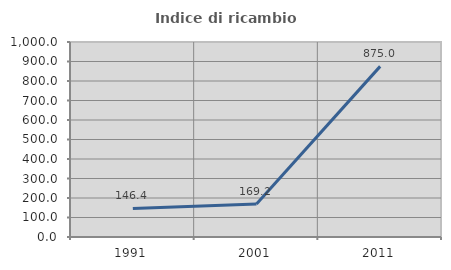
| Category | Indice di ricambio occupazionale  |
|---|---|
| 1991.0 | 146.429 |
| 2001.0 | 169.231 |
| 2011.0 | 875 |